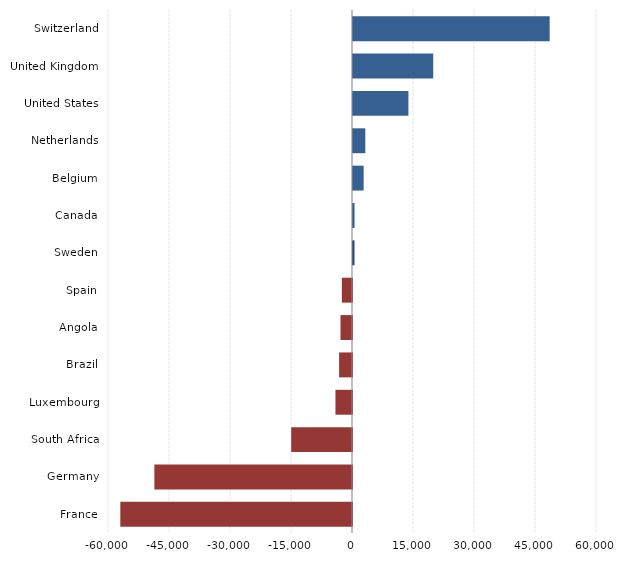
| Category | Series 0 |
|---|---|
| Switzerland | 48360 |
| United Kingdom | 19730 |
| United States | 13630 |
| Netherlands | 3030 |
| Belgium | 2620 |
| Canada | 380 |
| Sweden | 370 |
| Spain | -2500 |
| Angola | -2830 |
| Brazil | -3170 |
| Luxembourg | -4070 |
| South Africa | -14950 |
| Germany | -48600 |
| France | -56970 |